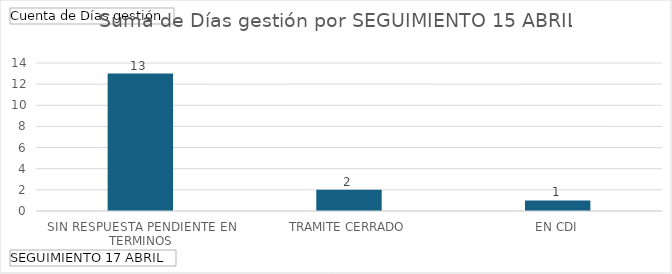
| Category | Total |
|---|---|
| SIN RESPUESTA PENDIENTE EN TERMINOS | 13 |
| TRAMITE CERRADO | 2 |
| EN CDI | 1 |